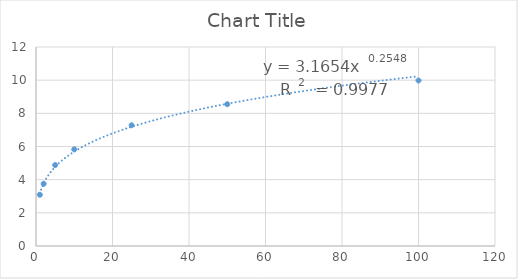
| Category | Series 0 |
|---|---|
| 1.0 | 3.09 |
| 2.0 | 3.75 |
| 5.0 | 4.88 |
| 10.0 | 5.83 |
| 25.0 | 7.28 |
| 50.0 | 8.55 |
| 100.0 | 9.98 |